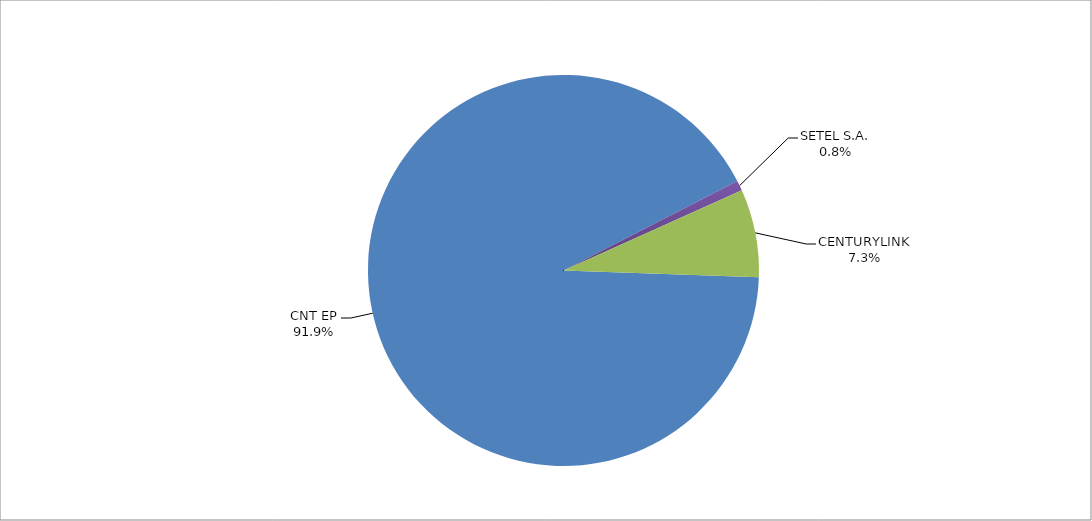
| Category | Series 0 |
|---|---|
| CNT EP | 328 |
| SETEL S.A. | 3 |
| CENTURYLINK | 26 |